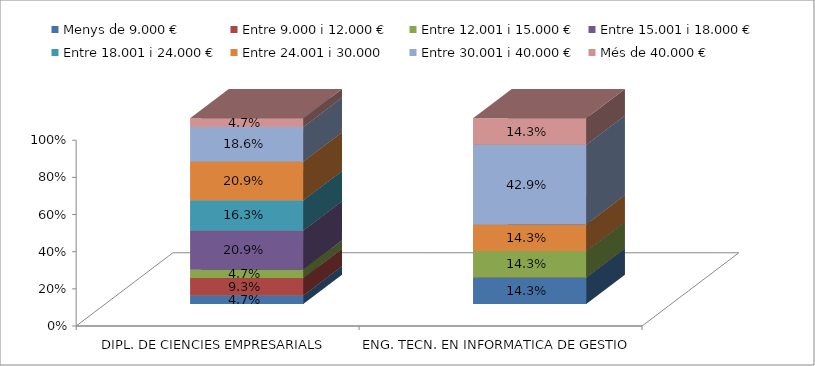
| Category | Menys de 9.000 € | Entre 9.000 i 12.000 € | Entre 12.001 i 15.000 € | Entre 15.001 i 18.000 € | Entre 18.001 i 24.000 € | Entre 24.001 i 30.000 | Entre 30.001 i 40.000 € | Més de 40.000 € |
|---|---|---|---|---|---|---|---|---|
| DIPL. DE CIENCIES EMPRESARIALS | 0.047 | 0.093 | 0.047 | 0.209 | 0.163 | 0.209 | 0.186 | 0.047 |
| ENG. TECN. EN INFORMATICA DE GESTIO | 0.143 | 0 | 0.143 | 0 | 0 | 0.143 | 0.429 | 0.143 |